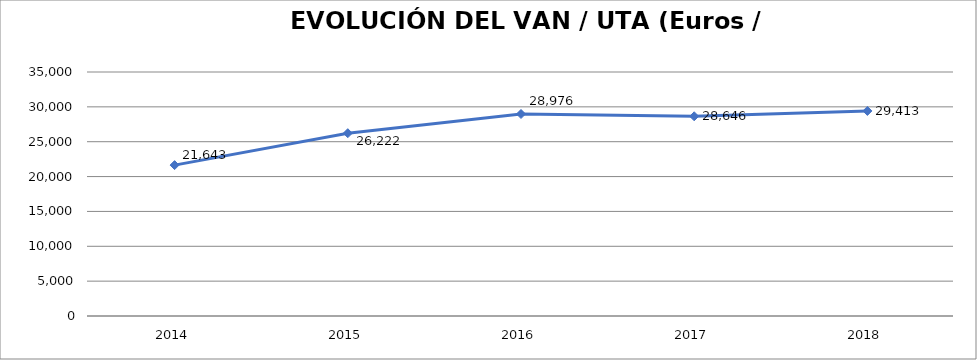
| Category | 2014 |
|---|---|
| 2014.0 | 21643.401 |
| 2015.0 | 26221.535 |
| 2016.0 | 28975.959 |
| 2017.0 | 28646.454 |
| 2018.0 | 29413.273 |